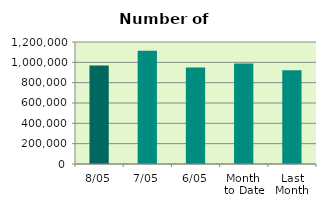
| Category | Series 0 |
|---|---|
| 8/05 | 968864 |
| 7/05 | 1112922 |
| 6/05 | 949852 |
| Month 
to Date | 987576.4 |
| Last
Month | 921109.3 |